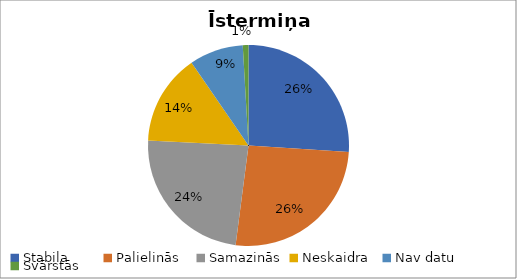
| Category | Īstermiņa (visi) |
|---|---|
| Stabila | 57 |
| Palielinās | 57 |
| Samazinās | 52 |
| Neskaidra | 32 |
| Nav datu | 19 |
| Svārstās | 2 |